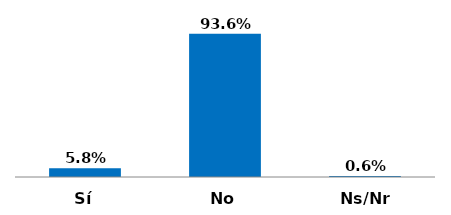
| Category | Series 0 |
|---|---|
| Sí | 0.058 |
| No | 0.936 |
| Ns/Nr | 0.006 |